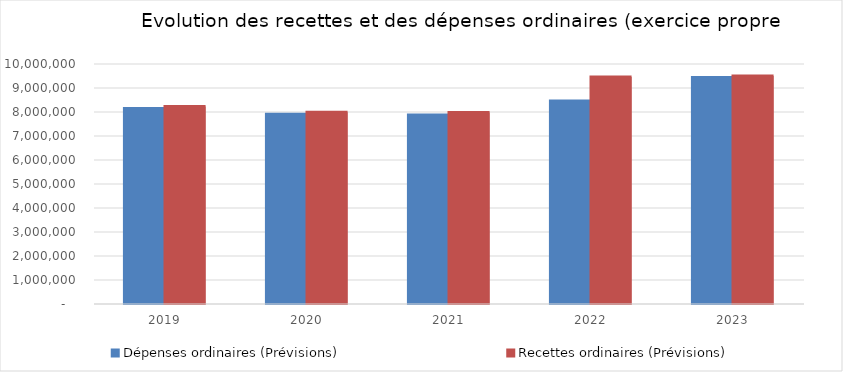
| Category | Dépenses ordinaires (Prévisions) | Recettes ordinaires (Prévisions) |
|---|---|---|
| 2019.0 | 8141517.75 | 8226553.73 |
| 2020.0 | 7905835.94 | 7987434.23 |
| 2021.0 | 7876339.12 | 7974751.87 |
| 2022.0 | 8457256.17 | 9455947.67 |
| 2023.0 | 9438549.24 | 9505000.37 |